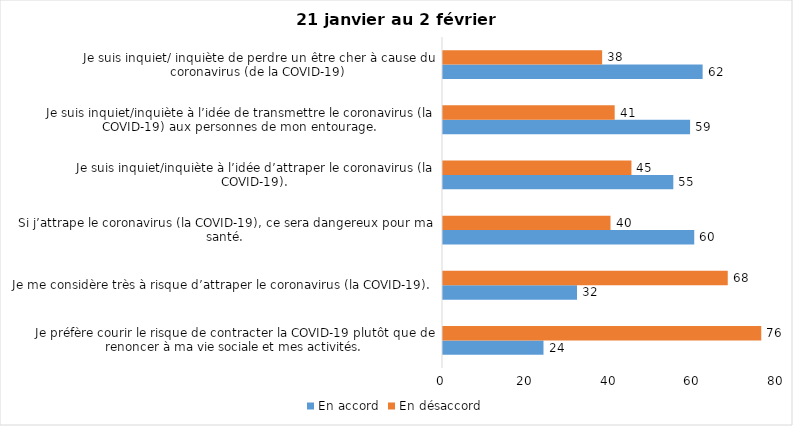
| Category | En accord | En désaccord |
|---|---|---|
| Je préfère courir le risque de contracter la COVID-19 plutôt que de renoncer à ma vie sociale et mes activités. | 24 | 76 |
| Je me considère très à risque d’attraper le coronavirus (la COVID-19). | 32 | 68 |
| Si j’attrape le coronavirus (la COVID-19), ce sera dangereux pour ma santé. | 60 | 40 |
| Je suis inquiet/inquiète à l’idée d’attraper le coronavirus (la COVID-19). | 55 | 45 |
| Je suis inquiet/inquiète à l’idée de transmettre le coronavirus (la COVID-19) aux personnes de mon entourage. | 59 | 41 |
| Je suis inquiet/ inquiète de perdre un être cher à cause du coronavirus (de la COVID-19) | 62 | 38 |